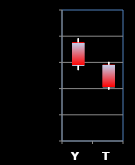
| Category | Series 0 | Series 1 | Series 2 | Series 3 |
|---|---|---|---|---|
| Y | 3.188 | 3.196 | 3.135 | 3.144 |
| T | 3.145 | 3.151 | 3.098 | 3.103 |